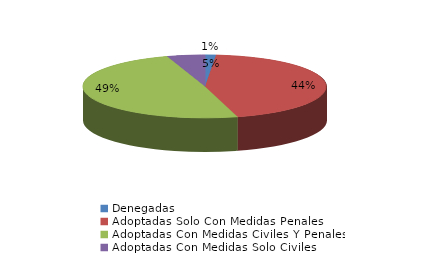
| Category | Series 0 |
|---|---|
| Denegadas | 2 |
| Adoptadas Solo Con Medidas Penales | 62 |
| Adoptadas Con Medidas Civiles Y Penales | 69 |
| Adoptadas Con Medidas Solo Civiles | 7 |